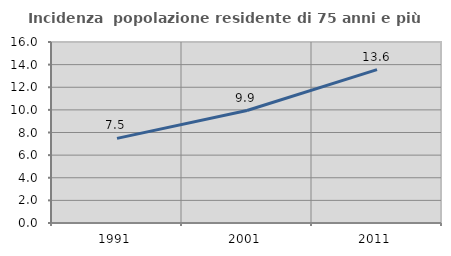
| Category | Incidenza  popolazione residente di 75 anni e più |
|---|---|
| 1991.0 | 7.484 |
| 2001.0 | 9.943 |
| 2011.0 | 13.553 |